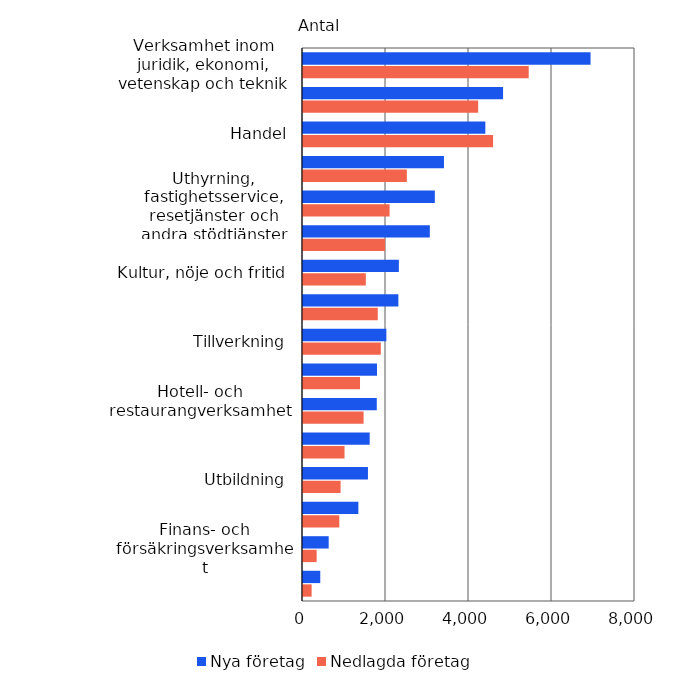
| Category | Nya företag | Nedlagda företag |
|---|---|---|
| Verksamhet inom juridik, ekonomi, vetenskap och teknik | 6929 | 5439 |
| Byggverksamhet | 4821 | 4221 |
| Handel | 4394 | 4580 |
| Annan serviceverksamhet | 3397 | 2502 |
| Uthyrning, fastighetsservice, resetjänster och andra stödtjänster | 3177 | 2086 |
| Transport och magasinering | 3056 | 1977 |
| Kultur, nöje och fritid | 2310 | 1514 |
| Informations- och kommunikationsverksamhet | 2298 | 1802 |
| Tillverkning | 2009 | 1875 |
| Vård och omsorg: sociala tjänster | 1783 | 1374 |
| Hotell- och restaurangverksamhet | 1778 | 1460 |
| Jordbruk, skogsbruk och fiske | 1607 | 1001 |
| Utbildning | 1565 | 906 |
| Fastighetsverksamhet | 1334 | 875 |
| Finans- och försäkringsverksamhet | 619 | 329 |
| Övriga | 416 | 208 |